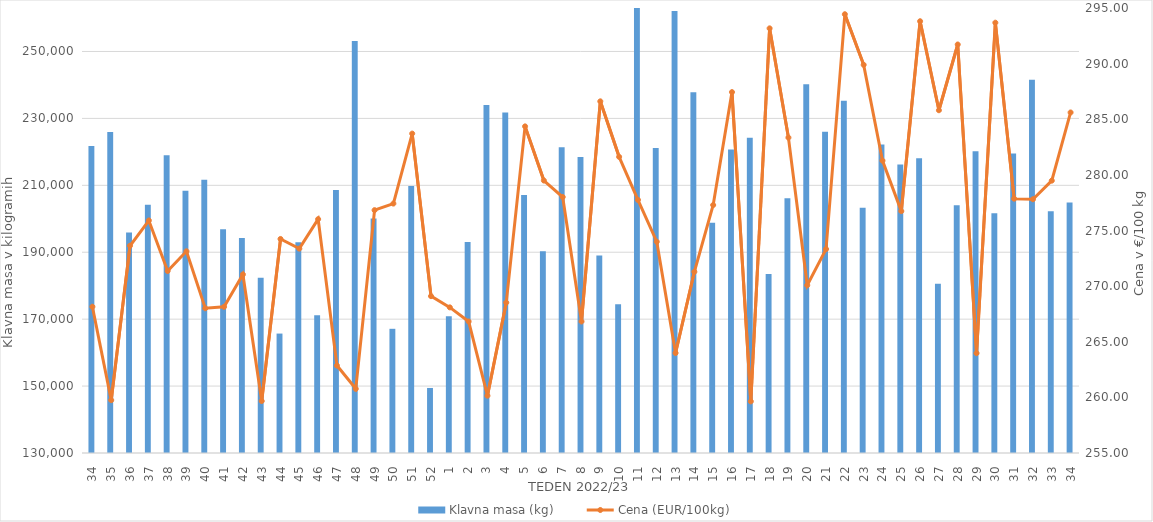
| Category | Klavna masa (kg) |
|---|---|
| 34.0 | 221748 |
| 35.0 | 225927 |
| 36.0 | 195924 |
| 37.0 | 204224 |
| 38.0 | 218966 |
| 39.0 | 208403 |
| 40.0 | 211635 |
| 41.0 | 196841 |
| 42.0 | 194271 |
| 43.0 | 182399 |
| 44.0 | 165696 |
| 45.0 | 193022 |
| 46.0 | 171172 |
| 47.0 | 208597 |
| 48.0 | 253151 |
| 49.0 | 200117 |
| 50.0 | 167119 |
| 51.0 | 209797 |
| 52.0 | 149439 |
| 1.0 | 170843 |
| 2.0 | 193093 |
| 3.0 | 234042 |
| 4.0 | 231737 |
| 5.0 | 207136 |
| 6.0 | 190311 |
| 7.0 | 221366 |
| 8.0 | 218470 |
| 9.0 | 189006 |
| 10.0 | 174425 |
| 11.0 | 265476 |
| 12.0 | 221171 |
| 13.0 | 262102 |
| 14.0 | 237813 |
| 15.0 | 198828 |
| 16.0 | 220686 |
| 17.0 | 224192 |
| 18.0 | 183508 |
| 19.0 | 206133 |
| 20.0 | 240223 |
| 21.0 | 226050 |
| 22.0 | 235273 |
| 23.0 | 203306 |
| 24.0 | 222178 |
| 25.0 | 216259 |
| 26.0 | 218064 |
| 27.0 | 180556 |
| 28.0 | 204078 |
| 29.0 | 220162 |
| 30.0 | 201649 |
| 31.0 | 219538 |
| 32.0 | 241549 |
| 33.0 | 202261 |
| 34.0 | 204903 |